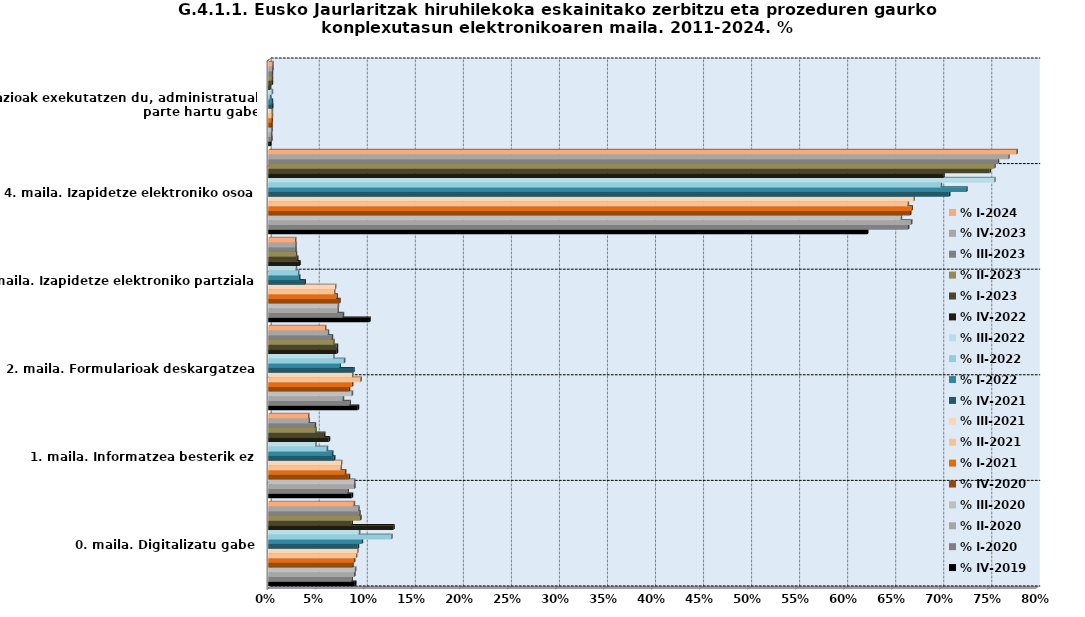
| Category | % |
|---|---|
|  0. maila. Digitalizatu gabe | 0.089 |
| 1. maila. Informatzea besterik ez | 0.041 |
| 2. maila. Formularioak deskargatzea | 0.059 |
| 3. maila. Izapidetze elektroniko partziala | 0.028 |
| 4. maila. Izapidetze elektroniko osoa | 0.779 |
| 5. maila. Administrazioak exekutatzen du, administratuak parte hartu gabe | 0.004 |